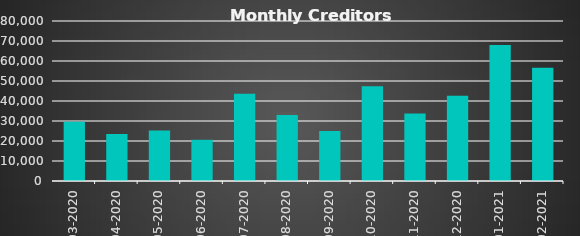
| Category |  Creditors  |
|---|---|
| 2020-03-31 | 29571.6 |
| 2020-04-30 | 23495.4 |
| 2020-05-31 | 25276.4 |
| 2020-06-30 | 20602.08 |
| 2020-07-31 | 43639.2 |
| 2020-08-31 | 33003 |
| 2020-09-30 | 25000.2 |
| 2020-10-31 | 47401.2 |
| 2020-11-30 | 33732.6 |
| 2020-12-31 | 42563.04 |
| 2021-01-31 | 67985.92 |
| 2021-02-28 | 56649.76 |